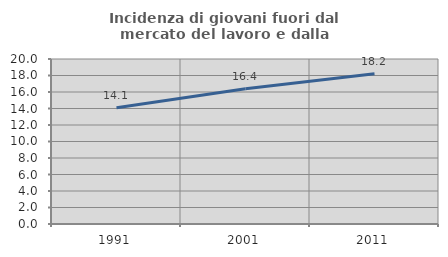
| Category | Incidenza di giovani fuori dal mercato del lavoro e dalla formazione  |
|---|---|
| 1991.0 | 14.093 |
| 2001.0 | 16.393 |
| 2011.0 | 18.224 |